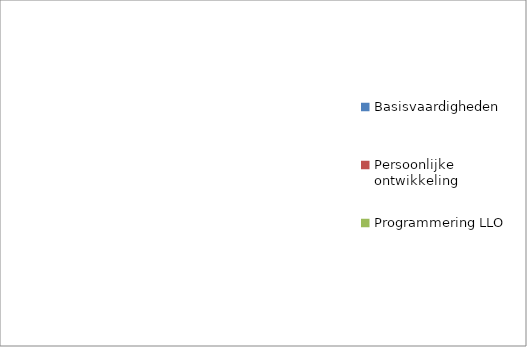
| Category | Series 0 |
|---|---|
| Basisvaardigheden | 0 |
| Persoonlijke ontwikkeling | 0 |
| Programmering LLO | 0 |